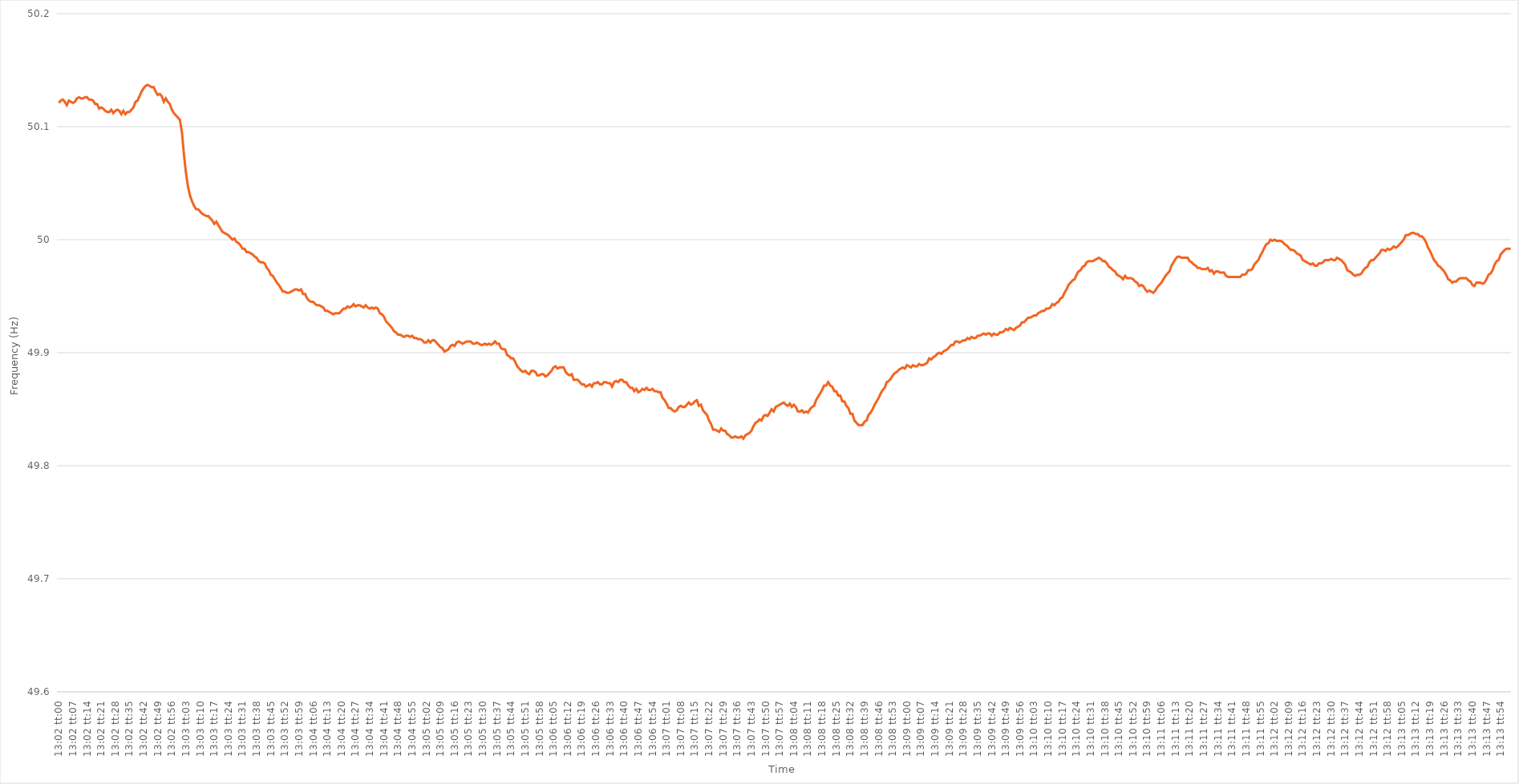
| Category | Series 0 |
|---|---|
| 0.5430555555555555 | 50.121 |
| 0.5430671296296297 | 50.123 |
| 0.5430787037037037 | 50.124 |
| 0.5430902777777777 | 50.122 |
| 0.5431018518518519 | 50.119 |
| 0.5431134259259259 | 50.123 |
| 0.543125 | 50.122 |
| 0.543136574074074 | 50.121 |
| 0.5431481481481482 | 50.122 |
| 0.5431597222222222 | 50.125 |
| 0.5431712962962963 | 50.126 |
| 0.5431828703703704 | 50.125 |
| 0.5431944444444444 | 50.125 |
| 0.5432060185185185 | 50.126 |
| 0.5432175925925926 | 50.126 |
| 0.5432291666666667 | 50.124 |
| 0.5432407407407408 | 50.124 |
| 0.5432523148148148 | 50.123 |
| 0.5432638888888889 | 50.12 |
| 0.5432754629629629 | 50.12 |
| 0.5432870370370371 | 50.116 |
| 0.5432986111111111 | 50.117 |
| 0.5433101851851853 | 50.116 |
| 0.5433217592592593 | 50.114 |
| 0.5433333333333333 | 50.113 |
| 0.5433449074074074 | 50.113 |
| 0.5433564814814814 | 50.115 |
| 0.5433680555555556 | 50.112 |
| 0.5433796296296296 | 50.114 |
| 0.5433912037037038 | 50.115 |
| 0.5434027777777778 | 50.114 |
| 0.5434143518518518 | 50.111 |
| 0.5434259259259259 | 50.114 |
| 0.5434375 | 50.111 |
| 0.5434490740740741 | 50.113 |
| 0.5434606481481482 | 50.113 |
| 0.5434722222222222 | 50.115 |
| 0.5434837962962963 | 50.117 |
| 0.5434953703703703 | 50.122 |
| 0.5435069444444445 | 50.123 |
| 0.5435185185185185 | 50.127 |
| 0.5435300925925927 | 50.131 |
| 0.5435416666666667 | 50.134 |
| 0.5435532407407407 | 50.136 |
| 0.5435648148148148 | 50.137 |
| 0.5435763888888888 | 50.136 |
| 0.543587962962963 | 50.135 |
| 0.543599537037037 | 50.135 |
| 0.5436111111111112 | 50.131 |
| 0.5436226851851852 | 50.128 |
| 0.5436342592592592 | 50.129 |
| 0.5436458333333333 | 50.127 |
| 0.5436574074074074 | 50.122 |
| 0.5436689814814815 | 50.125 |
| 0.5436805555555556 | 50.122 |
| 0.5436921296296297 | 50.12 |
| 0.5437037037037037 | 50.115 |
| 0.5437152777777777 | 50.112 |
| 0.5437268518518519 | 50.11 |
| 0.5437384259259259 | 50.108 |
| 0.5437500000000001 | 50.106 |
| 0.5437615740740741 | 50.095 |
| 0.5437731481481481 | 50.075 |
| 0.5437847222222222 | 50.059 |
| 0.5437962962962963 | 50.047 |
| 0.5438078703703704 | 50.039 |
| 0.5438194444444444 | 50.034 |
| 0.5438310185185186 | 50.03 |
| 0.5438425925925926 | 50.027 |
| 0.5438541666666666 | 50.027 |
| 0.5438657407407407 | 50.025 |
| 0.5438773148148148 | 50.023 |
| 0.5438888888888889 | 50.022 |
| 0.543900462962963 | 50.021 |
| 0.543912037037037 | 50.021 |
| 0.5439236111111111 | 50.019 |
| 0.5439351851851851 | 50.017 |
| 0.5439467592592593 | 50.014 |
| 0.5439583333333333 | 50.016 |
| 0.5439699074074075 | 50.013 |
| 0.5439814814814815 | 50.01 |
| 0.5439930555555555 | 50.007 |
| 0.5440046296296296 | 50.006 |
| 0.5440162037037037 | 50.005 |
| 0.5440277777777778 | 50.004 |
| 0.5440393518518518 | 50.002 |
| 0.544050925925926 | 50 |
| 0.5440625 | 50.001 |
| 0.544074074074074 | 49.998 |
| 0.5440856481481481 | 49.997 |
| 0.5440972222222222 | 49.995 |
| 0.5441087962962963 | 49.992 |
| 0.5441203703703704 | 49.992 |
| 0.5441319444444445 | 49.989 |
| 0.5441435185185185 | 49.989 |
| 0.5441550925925925 | 49.988 |
| 0.5441666666666667 | 49.987 |
| 0.5441782407407407 | 49.985 |
| 0.5441898148148149 | 49.984 |
| 0.5442013888888889 | 49.981 |
| 0.544212962962963 | 49.98 |
| 0.544224537037037 | 49.98 |
| 0.5442361111111111 | 49.979 |
| 0.5442476851851852 | 49.975 |
| 0.5442592592592593 | 49.973 |
| 0.5442708333333334 | 49.969 |
| 0.5442824074074074 | 49.968 |
| 0.5442939814814814 | 49.965 |
| 0.5443055555555555 | 49.962 |
| 0.5443171296296296 | 49.96 |
| 0.5443287037037037 | 49.957 |
| 0.5443402777777778 | 49.954 |
| 0.5443518518518519 | 49.954 |
| 0.5443634259259259 | 49.953 |
| 0.5443749999999999 | 49.953 |
| 0.5443865740740741 | 49.954 |
| 0.5443981481481481 | 49.955 |
| 0.5444097222222223 | 49.956 |
| 0.5444212962962963 | 49.956 |
| 0.5444328703703704 | 49.955 |
| 0.5444444444444444 | 49.956 |
| 0.5444560185185185 | 49.952 |
| 0.5444675925925926 | 49.952 |
| 0.5444791666666667 | 49.948 |
| 0.5444907407407408 | 49.946 |
| 0.5445023148148148 | 49.945 |
| 0.5445138888888889 | 49.945 |
| 0.5445254629629629 | 49.943 |
| 0.544537037037037 | 49.942 |
| 0.5445486111111111 | 49.942 |
| 0.5445601851851852 | 49.941 |
| 0.5445717592592593 | 49.94 |
| 0.5445833333333333 | 49.937 |
| 0.5445949074074073 | 49.937 |
| 0.5446064814814815 | 49.936 |
| 0.5446180555555555 | 49.935 |
| 0.5446296296296297 | 49.934 |
| 0.5446412037037037 | 49.935 |
| 0.5446527777777778 | 49.935 |
| 0.5446643518518518 | 49.935 |
| 0.544675925925926 | 49.937 |
| 0.5446875 | 49.939 |
| 0.5446990740740741 | 49.939 |
| 0.5447106481481482 | 49.941 |
| 0.5447222222222222 | 49.94 |
| 0.5447337962962963 | 49.941 |
| 0.5447453703703703 | 49.943 |
| 0.5447569444444444 | 49.941 |
| 0.5447685185185185 | 49.942 |
| 0.5447800925925926 | 49.942 |
| 0.5447916666666667 | 49.941 |
| 0.5448032407407407 | 49.94 |
| 0.5448148148148148 | 49.942 |
| 0.5448263888888889 | 49.94 |
| 0.5448379629629629 | 49.939 |
| 0.5448495370370371 | 49.94 |
| 0.5448611111111111 | 49.939 |
| 0.5448726851851852 | 49.94 |
| 0.5448842592592592 | 49.939 |
| 0.5448958333333334 | 49.935 |
| 0.5449074074074074 | 49.934 |
| 0.5449189814814815 | 49.932 |
| 0.5449305555555556 | 49.928 |
| 0.5449421296296296 | 49.926 |
| 0.5449537037037037 | 49.924 |
| 0.5449652777777778 | 49.922 |
| 0.5449768518518519 | 49.919 |
| 0.5449884259259259 | 49.918 |
| 0.545 | 49.916 |
| 0.5450115740740741 | 49.916 |
| 0.5450231481481481 | 49.915 |
| 0.5450347222222222 | 49.914 |
| 0.5450462962962963 | 49.915 |
| 0.5450578703703703 | 49.915 |
| 0.5450694444444445 | 49.914 |
| 0.5450810185185185 | 49.915 |
| 0.5450925925925926 | 49.913 |
| 0.5451041666666666 | 49.913 |
| 0.5451157407407408 | 49.912 |
| 0.5451273148148148 | 49.912 |
| 0.545138888888889 | 49.911 |
| 0.545150462962963 | 49.909 |
| 0.545162037037037 | 49.909 |
| 0.5451736111111111 | 49.911 |
| 0.5451851851851852 | 49.909 |
| 0.5451967592592593 | 49.911 |
| 0.5452083333333334 | 49.911 |
| 0.5452199074074074 | 49.909 |
| 0.5452314814814815 | 49.907 |
| 0.5452430555555555 | 49.905 |
| 0.5452546296296296 | 49.904 |
| 0.5452662037037037 | 49.901 |
| 0.5452777777777778 | 49.902 |
| 0.5452893518518519 | 49.903 |
| 0.5453009259259259 | 49.906 |
| 0.5453125 | 49.907 |
| 0.545324074074074 | 49.906 |
| 0.5453356481481482 | 49.909 |
| 0.5453472222222222 | 49.91 |
| 0.5453587962962964 | 49.909 |
| 0.5453703703703704 | 49.908 |
| 0.5453819444444444 | 49.909 |
| 0.5453935185185185 | 49.91 |
| 0.5454050925925926 | 49.91 |
| 0.5454166666666667 | 49.91 |
| 0.5454282407407408 | 49.908 |
| 0.5454398148148148 | 49.908 |
| 0.5454513888888889 | 49.909 |
| 0.5454629629629629 | 49.908 |
| 0.545474537037037 | 49.907 |
| 0.5454861111111111 | 49.907 |
| 0.5454976851851852 | 49.908 |
| 0.5455092592592593 | 49.907 |
| 0.5455208333333333 | 49.908 |
| 0.5455324074074074 | 49.907 |
| 0.5455439814814814 | 49.908 |
| 0.5455555555555556 | 49.91 |
| 0.5455671296296296 | 49.908 |
| 0.5455787037037038 | 49.908 |
| 0.5455902777777778 | 49.904 |
| 0.5456018518518518 | 49.903 |
| 0.5456134259259259 | 49.903 |
| 0.545625 | 49.898 |
| 0.5456365740740741 | 49.897 |
| 0.5456481481481482 | 49.895 |
| 0.5456597222222223 | 49.895 |
| 0.5456712962962963 | 49.892 |
| 0.5456828703703703 | 49.888 |
| 0.5456944444444444 | 49.886 |
| 0.5457060185185185 | 49.884 |
| 0.5457175925925926 | 49.883 |
| 0.5457291666666667 | 49.884 |
| 0.5457407407407407 | 49.882 |
| 0.5457523148148148 | 49.881 |
| 0.5457638888888888 | 49.884 |
| 0.545775462962963 | 49.884 |
| 0.545787037037037 | 49.883 |
| 0.5457986111111112 | 49.88 |
| 0.5458101851851852 | 49.88 |
| 0.5458217592592592 | 49.881 |
| 0.5458333333333333 | 49.881 |
| 0.5458449074074074 | 49.879 |
| 0.5458564814814815 | 49.88 |
| 0.5458680555555556 | 49.882 |
| 0.5458796296296297 | 49.884 |
| 0.5458912037037037 | 49.887 |
| 0.5459027777777777 | 49.888 |
| 0.5459143518518519 | 49.886 |
| 0.5459259259259259 | 49.887 |
| 0.5459375 | 49.887 |
| 0.5459490740740741 | 49.887 |
| 0.5459606481481482 | 49.883 |
| 0.5459722222222222 | 49.881 |
| 0.5459837962962962 | 49.88 |
| 0.5459953703703704 | 49.881 |
| 0.5460069444444444 | 49.876 |
| 0.5460185185185186 | 49.876 |
| 0.5460300925925926 | 49.876 |
| 0.5460416666666666 | 49.874 |
| 0.5460532407407407 | 49.872 |
| 0.5460648148148148 | 49.872 |
| 0.5460763888888889 | 49.87 |
| 0.546087962962963 | 49.871 |
| 0.5460995370370371 | 49.872 |
| 0.5461111111111111 | 49.87 |
| 0.5461226851851851 | 49.873 |
| 0.5461342592592593 | 49.873 |
| 0.5461458333333333 | 49.874 |
| 0.5461574074074075 | 49.872 |
| 0.5461689814814815 | 49.872 |
| 0.5461805555555556 | 49.874 |
| 0.5461921296296296 | 49.874 |
| 0.5462037037037036 | 49.873 |
| 0.5462152777777778 | 49.873 |
| 0.5462268518518518 | 49.87 |
| 0.546238425925926 | 49.874 |
| 0.54625 | 49.875 |
| 0.546261574074074 | 49.874 |
| 0.5462731481481481 | 49.876 |
| 0.5462847222222222 | 49.876 |
| 0.5462962962962963 | 49.874 |
| 0.5463078703703704 | 49.874 |
| 0.5463194444444445 | 49.871 |
| 0.5463310185185185 | 49.869 |
| 0.5463425925925925 | 49.869 |
| 0.5463541666666667 | 49.866 |
| 0.5463657407407407 | 49.868 |
| 0.5463773148148149 | 49.865 |
| 0.5463888888888889 | 49.866 |
| 0.546400462962963 | 49.868 |
| 0.546412037037037 | 49.867 |
| 0.546423611111111 | 49.869 |
| 0.5464351851851852 | 49.867 |
| 0.5464467592592592 | 49.867 |
| 0.5464583333333334 | 49.868 |
| 0.5464699074074074 | 49.866 |
| 0.5464814814814815 | 49.866 |
| 0.5464930555555555 | 49.865 |
| 0.5465046296296296 | 49.865 |
| 0.5465162037037037 | 49.86 |
| 0.5465277777777778 | 49.858 |
| 0.5465393518518519 | 49.855 |
| 0.5465509259259259 | 49.851 |
| 0.5465625 | 49.851 |
| 0.5465740740740741 | 49.849 |
| 0.5465856481481481 | 49.848 |
| 0.5465972222222223 | 49.849 |
| 0.5466087962962963 | 49.852 |
| 0.5466203703703704 | 49.853 |
| 0.5466319444444444 | 49.852 |
| 0.5466435185185184 | 49.852 |
| 0.5466550925925926 | 49.854 |
| 0.5466666666666666 | 49.856 |
| 0.5466782407407408 | 49.854 |
| 0.5466898148148148 | 49.855 |
| 0.5467013888888889 | 49.857 |
| 0.5467129629629629 | 49.858 |
| 0.546724537037037 | 49.853 |
| 0.5467361111111111 | 49.854 |
| 0.5467476851851852 | 49.849 |
| 0.5467592592592593 | 49.847 |
| 0.5467708333333333 | 49.845 |
| 0.5467824074074074 | 49.84 |
| 0.5467939814814815 | 49.837 |
| 0.5468055555555555 | 49.832 |
| 0.5468171296296297 | 49.832 |
| 0.5468287037037037 | 49.831 |
| 0.5468402777777778 | 49.83 |
| 0.5468518518518518 | 49.833 |
| 0.546863425925926 | 49.831 |
| 0.546875 | 49.831 |
| 0.546886574074074 | 49.828 |
| 0.5468981481481482 | 49.827 |
| 0.5469097222222222 | 49.825 |
| 0.5469212962962963 | 49.825 |
| 0.5469328703703703 | 49.826 |
| 0.5469444444444445 | 49.825 |
| 0.5469560185185185 | 49.825 |
| 0.5469675925925926 | 49.826 |
| 0.5469791666666667 | 49.824 |
| 0.5469907407407407 | 49.827 |
| 0.5470023148148148 | 49.828 |
| 0.5470138888888889 | 49.829 |
| 0.547025462962963 | 49.831 |
| 0.5470370370370371 | 49.835 |
| 0.5470486111111111 | 49.838 |
| 0.5470601851851852 | 49.839 |
| 0.5470717592592592 | 49.841 |
| 0.5470833333333334 | 49.84 |
| 0.5470949074074074 | 49.844 |
| 0.5471064814814816 | 49.845 |
| 0.5471180555555556 | 49.844 |
| 0.5471296296296296 | 49.847 |
| 0.5471412037037037 | 49.85 |
| 0.5471527777777777 | 49.848 |
| 0.5471643518518519 | 49.852 |
| 0.5471759259259259 | 49.853 |
| 0.5471875 | 49.854 |
| 0.5471990740740741 | 49.855 |
| 0.5472106481481481 | 49.856 |
| 0.5472222222222222 | 49.854 |
| 0.5472337962962963 | 49.853 |
| 0.5472453703703704 | 49.855 |
| 0.5472569444444445 | 49.852 |
| 0.5472685185185185 | 49.854 |
| 0.5472800925925926 | 49.852 |
| 0.5472916666666666 | 49.848 |
| 0.5473032407407408 | 49.848 |
| 0.5473148148148148 | 49.849 |
| 0.547326388888889 | 49.847 |
| 0.547337962962963 | 49.848 |
| 0.547349537037037 | 49.847 |
| 0.5473611111111111 | 49.85 |
| 0.5473726851851851 | 49.852 |
| 0.5473842592592593 | 49.853 |
| 0.5473958333333333 | 49.858 |
| 0.5474074074074075 | 49.861 |
| 0.5474189814814815 | 49.864 |
| 0.5474305555555555 | 49.867 |
| 0.5474421296296296 | 49.871 |
| 0.5474537037037037 | 49.871 |
| 0.5474652777777778 | 49.874 |
| 0.5474768518518519 | 49.871 |
| 0.547488425925926 | 49.87 |
| 0.5475 | 49.866 |
| 0.547511574074074 | 49.866 |
| 0.5475231481481482 | 49.862 |
| 0.5475347222222222 | 49.862 |
| 0.5475462962962964 | 49.857 |
| 0.5475578703703704 | 49.857 |
| 0.5475694444444444 | 49.853 |
| 0.5475810185185185 | 49.851 |
| 0.5475925925925925 | 49.846 |
| 0.5476041666666667 | 49.846 |
| 0.5476157407407407 | 49.84 |
| 0.5476273148148149 | 49.838 |
| 0.5476388888888889 | 49.836 |
| 0.5476504629629629 | 49.836 |
| 0.547662037037037 | 49.836 |
| 0.5476736111111111 | 49.839 |
| 0.5476851851851852 | 49.84 |
| 0.5476967592592593 | 49.845 |
| 0.5477083333333334 | 49.847 |
| 0.5477199074074074 | 49.85 |
| 0.5477314814814814 | 49.854 |
| 0.5477430555555556 | 49.857 |
| 0.5477546296296296 | 49.86 |
| 0.5477662037037038 | 49.864 |
| 0.5477777777777778 | 49.867 |
| 0.5477893518518518 | 49.869 |
| 0.5478009259259259 | 49.874 |
| 0.5478125 | 49.875 |
| 0.5478240740740741 | 49.877 |
| 0.5478356481481481 | 49.88 |
| 0.5478472222222223 | 49.882 |
| 0.5478587962962963 | 49.883 |
| 0.5478703703703703 | 49.885 |
| 0.5478819444444444 | 49.886 |
| 0.5478935185185185 | 49.887 |
| 0.5479050925925926 | 49.886 |
| 0.5479166666666667 | 49.889 |
| 0.5479282407407408 | 49.888 |
| 0.5479398148148148 | 49.887 |
| 0.5479513888888888 | 49.889 |
| 0.547962962962963 | 49.888 |
| 0.547974537037037 | 49.888 |
| 0.5479861111111112 | 49.89 |
| 0.5479976851851852 | 49.889 |
| 0.5480092592592593 | 49.889 |
| 0.5480208333333333 | 49.89 |
| 0.5480324074074074 | 49.891 |
| 0.5480439814814815 | 49.895 |
| 0.5480555555555555 | 49.894 |
| 0.5480671296296297 | 49.896 |
| 0.5480787037037037 | 49.897 |
| 0.5480902777777777 | 49.899 |
| 0.5481018518518518 | 49.9 |
| 0.5481134259259259 | 49.899 |
| 0.548125 | 49.901 |
| 0.5481365740740741 | 49.902 |
| 0.5481481481481482 | 49.903 |
| 0.5481597222222222 | 49.905 |
| 0.5481712962962962 | 49.907 |
| 0.5481828703703704 | 49.907 |
| 0.5481944444444444 | 49.91 |
| 0.5482060185185186 | 49.91 |
| 0.5482175925925926 | 49.909 |
| 0.5482291666666667 | 49.91 |
| 0.5482407407407407 | 49.911 |
| 0.5482523148148148 | 49.911 |
| 0.5482638888888889 | 49.913 |
| 0.548275462962963 | 49.912 |
| 0.5482870370370371 | 49.914 |
| 0.5482986111111111 | 49.913 |
| 0.5483101851851852 | 49.913 |
| 0.5483217592592592 | 49.915 |
| 0.5483333333333333 | 49.915 |
| 0.5483449074074074 | 49.916 |
| 0.5483564814814815 | 49.917 |
| 0.5483680555555556 | 49.916 |
| 0.5483796296296296 | 49.917 |
| 0.5483912037037036 | 49.917 |
| 0.5484027777777778 | 49.915 |
| 0.5484143518518518 | 49.917 |
| 0.548425925925926 | 49.916 |
| 0.5484375 | 49.916 |
| 0.5484490740740741 | 49.918 |
| 0.5484606481481481 | 49.918 |
| 0.5484722222222222 | 49.919 |
| 0.5484837962962963 | 49.921 |
| 0.5484953703703704 | 49.92 |
| 0.5485069444444445 | 49.922 |
| 0.5485185185185185 | 49.921 |
| 0.5485300925925926 | 49.92 |
| 0.5485416666666666 | 49.922 |
| 0.5485532407407407 | 49.923 |
| 0.5485648148148148 | 49.924 |
| 0.5485763888888889 | 49.927 |
| 0.548587962962963 | 49.927 |
| 0.548599537037037 | 49.929 |
| 0.548611111111111 | 49.931 |
| 0.5486226851851852 | 49.931 |
| 0.5486342592592592 | 49.932 |
| 0.5486458333333334 | 49.933 |
| 0.5486574074074074 | 49.933 |
| 0.5486689814814815 | 49.935 |
| 0.5486805555555555 | 49.936 |
| 0.5486921296296297 | 49.937 |
| 0.5487037037037037 | 49.937 |
| 0.5487152777777778 | 49.939 |
| 0.5487268518518519 | 49.939 |
| 0.5487384259259259 | 49.94 |
| 0.54875 | 49.943 |
| 0.5487615740740741 | 49.942 |
| 0.5487731481481481 | 49.944 |
| 0.5487847222222222 | 49.945 |
| 0.5487962962962963 | 49.948 |
| 0.5488078703703704 | 49.949 |
| 0.5488194444444444 | 49.953 |
| 0.5488310185185185 | 49.956 |
| 0.5488425925925926 | 49.96 |
| 0.5488541666666666 | 49.962 |
| 0.5488657407407408 | 49.964 |
| 0.5488773148148148 | 49.965 |
| 0.5488888888888889 | 49.969 |
| 0.5489004629629629 | 49.972 |
| 0.5489120370370371 | 49.973 |
| 0.5489236111111111 | 49.976 |
| 0.5489351851851852 | 49.977 |
| 0.5489467592592593 | 49.98 |
| 0.5489583333333333 | 49.981 |
| 0.5489699074074074 | 49.981 |
| 0.5489814814814815 | 49.981 |
| 0.5489930555555556 | 49.982 |
| 0.5490046296296297 | 49.983 |
| 0.5490162037037037 | 49.984 |
| 0.5490277777777778 | 49.983 |
| 0.5490393518518518 | 49.981 |
| 0.5490509259259259 | 49.981 |
| 0.5490625 | 49.979 |
| 0.549074074074074 | 49.976 |
| 0.5490856481481482 | 49.975 |
| 0.5490972222222222 | 49.973 |
| 0.5491087962962963 | 49.972 |
| 0.5491203703703703 | 49.969 |
| 0.5491319444444445 | 49.968 |
| 0.5491435185185185 | 49.967 |
| 0.5491550925925927 | 49.965 |
| 0.5491666666666667 | 49.968 |
| 0.5491782407407407 | 49.966 |
| 0.5491898148148148 | 49.966 |
| 0.5492013888888889 | 49.966 |
| 0.549212962962963 | 49.965 |
| 0.5492245370370371 | 49.963 |
| 0.5492361111111111 | 49.962 |
| 0.5492476851851852 | 49.959 |
| 0.5492592592592592 | 49.96 |
| 0.5492708333333333 | 49.959 |
| 0.5492824074074074 | 49.956 |
| 0.5492939814814815 | 49.954 |
| 0.5493055555555556 | 49.955 |
| 0.5493171296296296 | 49.954 |
| 0.5493287037037037 | 49.953 |
| 0.5493402777777777 | 49.955 |
| 0.5493518518518519 | 49.958 |
| 0.5493634259259259 | 49.96 |
| 0.5493750000000001 | 49.962 |
| 0.5493865740740741 | 49.965 |
| 0.5493981481481481 | 49.968 |
| 0.5494097222222222 | 49.97 |
| 0.5494212962962963 | 49.972 |
| 0.5494328703703704 | 49.977 |
| 0.5494444444444445 | 49.98 |
| 0.5494560185185186 | 49.983 |
| 0.5494675925925926 | 49.985 |
| 0.5494791666666666 | 49.985 |
| 0.5494907407407407 | 49.984 |
| 0.5495023148148148 | 49.984 |
| 0.5495138888888889 | 49.984 |
| 0.549525462962963 | 49.984 |
| 0.549537037037037 | 49.981 |
| 0.5495486111111111 | 49.98 |
| 0.5495601851851851 | 49.978 |
| 0.5495717592592593 | 49.977 |
| 0.5495833333333333 | 49.975 |
| 0.5495949074074075 | 49.975 |
| 0.5496064814814815 | 49.974 |
| 0.5496180555555555 | 49.974 |
| 0.5496296296296296 | 49.974 |
| 0.5496412037037037 | 49.975 |
| 0.5496527777777778 | 49.972 |
| 0.5496643518518519 | 49.973 |
| 0.549675925925926 | 49.97 |
| 0.5496875 | 49.972 |
| 0.549699074074074 | 49.972 |
| 0.5497106481481482 | 49.971 |
| 0.5497222222222222 | 49.971 |
| 0.5497337962962963 | 49.971 |
| 0.5497453703703704 | 49.968 |
| 0.5497569444444445 | 49.967 |
| 0.5497685185185185 | 49.967 |
| 0.5497800925925925 | 49.967 |
| 0.5497916666666667 | 49.967 |
| 0.5498032407407407 | 49.967 |
| 0.5498148148148149 | 49.967 |
| 0.5498263888888889 | 49.967 |
| 0.549837962962963 | 49.969 |
| 0.549849537037037 | 49.969 |
| 0.5498611111111111 | 49.97 |
| 0.5498726851851852 | 49.973 |
| 0.5498842592592593 | 49.973 |
| 0.5498958333333334 | 49.974 |
| 0.5499074074074074 | 49.978 |
| 0.5499189814814814 | 49.98 |
| 0.5499305555555556 | 49.982 |
| 0.5499421296296296 | 49.986 |
| 0.5499537037037037 | 49.989 |
| 0.5499652777777778 | 49.993 |
| 0.5499768518518519 | 49.996 |
| 0.5499884259259259 | 49.997 |
| 0.5499999999999999 | 50 |
| 0.5500115740740741 | 49.999 |
| 0.5500231481481481 | 50 |
| 0.5500347222222223 | 49.999 |
| 0.5500462962962963 | 49.999 |
| 0.5500578703703703 | 49.999 |
| 0.5500694444444444 | 49.998 |
| 0.5500810185185185 | 49.996 |
| 0.5500925925925926 | 49.995 |
| 0.5501041666666667 | 49.993 |
| 0.5501157407407408 | 49.991 |
| 0.5501273148148148 | 49.991 |
| 0.5501388888888888 | 49.99 |
| 0.550150462962963 | 49.988 |
| 0.550162037037037 | 49.987 |
| 0.5501736111111112 | 49.986 |
| 0.5501851851851852 | 49.982 |
| 0.5501967592592593 | 49.981 |
| 0.5502083333333333 | 49.98 |
| 0.5502199074074073 | 49.979 |
| 0.5502314814814815 | 49.978 |
| 0.5502430555555555 | 49.979 |
| 0.5502546296296297 | 49.977 |
| 0.5502662037037037 | 49.977 |
| 0.5502777777777778 | 49.979 |
| 0.5502893518518518 | 49.979 |
| 0.5503009259259259 | 49.98 |
| 0.5503125 | 49.982 |
| 0.5503240740740741 | 49.982 |
| 0.5503356481481482 | 49.982 |
| 0.5503472222222222 | 49.983 |
| 0.5503587962962962 | 49.982 |
| 0.5503703703703704 | 49.982 |
| 0.5503819444444444 | 49.984 |
| 0.5503935185185186 | 49.983 |
| 0.5504050925925926 | 49.982 |
| 0.5504166666666667 | 49.98 |
| 0.5504282407407407 | 49.978 |
| 0.5504398148148147 | 49.973 |
| 0.5504513888888889 | 49.972 |
| 0.5504629629629629 | 49.971 |
| 0.5504745370370371 | 49.969 |
| 0.5504861111111111 | 49.968 |
| 0.5504976851851852 | 49.969 |
| 0.5505092592592592 | 49.969 |
| 0.5505208333333333 | 49.97 |
| 0.5505324074074074 | 49.973 |
| 0.5505439814814815 | 49.975 |
| 0.5505555555555556 | 49.976 |
| 0.5505671296296296 | 49.98 |
| 0.5505787037037037 | 49.982 |
| 0.5505902777777778 | 49.982 |
| 0.5506018518518518 | 49.984 |
| 0.550613425925926 | 49.986 |
| 0.550625 | 49.988 |
| 0.5506365740740741 | 49.991 |
| 0.5506481481481481 | 49.991 |
| 0.5506597222222221 | 49.99 |
| 0.5506712962962963 | 49.992 |
| 0.5506828703703703 | 49.991 |
| 0.5506944444444445 | 49.992 |
| 0.5507060185185185 | 49.994 |
| 0.5507175925925926 | 49.993 |
| 0.5507291666666666 | 49.994 |
| 0.5507407407407408 | 49.996 |
| 0.5507523148148148 | 49.998 |
| 0.5507638888888889 | 50 |
| 0.550775462962963 | 50.004 |
| 0.550787037037037 | 50.004 |
| 0.5507986111111111 | 50.005 |
| 0.5508101851851852 | 50.006 |
| 0.5508217592592592 | 50.006 |
| 0.5508333333333334 | 50.005 |
| 0.5508449074074074 | 50.005 |
| 0.5508564814814815 | 50.003 |
| 0.5508680555555555 | 50.003 |
| 0.5508796296296297 | 50.001 |
| 0.5508912037037037 | 49.998 |
| 0.5509027777777779 | 49.993 |
| 0.5509143518518519 | 49.99 |
| 0.5509259259259259 | 49.986 |
| 0.5509375 | 49.982 |
| 0.550949074074074 | 49.98 |
| 0.5509606481481482 | 49.977 |
| 0.5509722222222222 | 49.976 |
| 0.5509837962962963 | 49.974 |
| 0.5509953703703704 | 49.972 |
| 0.5510069444444444 | 49.969 |
| 0.5510185185185185 | 49.965 |
| 0.5510300925925926 | 49.964 |
| 0.5510416666666667 | 49.962 |
| 0.5510532407407408 | 49.963 |
| 0.5510648148148148 | 49.963 |
| 0.5510763888888889 | 49.965 |
| 0.5510879629629629 | 49.966 |
| 0.5510995370370371 | 49.966 |
| 0.5511111111111111 | 49.966 |
| 0.5511226851851853 | 49.966 |
| 0.5511342592592593 | 49.964 |
| 0.5511458333333333 | 49.963 |
| 0.5511574074074074 | 49.96 |
| 0.5511689814814814 | 49.959 |
| 0.5511805555555556 | 49.962 |
| 0.5511921296296296 | 49.962 |
| 0.5512037037037038 | 49.962 |
| 0.5512152777777778 | 49.961 |
| 0.5512268518518518 | 49.962 |
| 0.5512384259259259 | 49.965 |
| 0.55125 | 49.969 |
| 0.5512615740740741 | 49.97 |
| 0.5512731481481482 | 49.973 |
| 0.5512847222222222 | 49.978 |
| 0.5512962962962963 | 49.981 |
| 0.5513078703703703 | 49.982 |
| 0.5513194444444445 | 49.987 |
| 0.5513310185185185 | 49.989 |
| 0.5513425925925927 | 49.991 |
| 0.5513541666666667 | 49.992 |
| 0.5513657407407407 | 49.992 |
| 0.5513773148148148 | 49.992 |